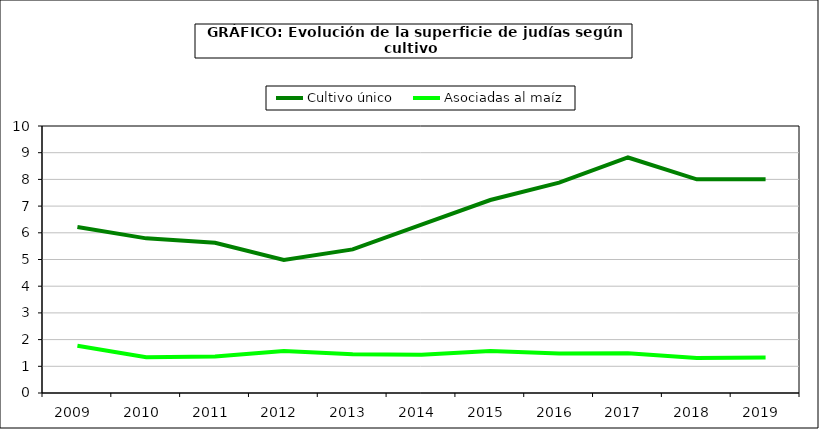
| Category | Cultivo único | Asociadas al maíz |
|---|---|---|
| 2009.0 | 6.216 | 1.766 |
| 2010.0 | 5.792 | 1.338 |
| 2011.0 | 5.626 | 1.363 |
| 2012.0 | 4.982 | 1.572 |
| 2013.0 | 5.378 | 1.451 |
| 2014.0 | 6.305 | 1.432 |
| 2015.0 | 7.227 | 1.575 |
| 2016.0 | 7.876 | 1.479 |
| 2017.0 | 8.821 | 1.489 |
| 2018.0 | 8.003 | 1.312 |
| 2019.0 | 8.001 | 1.325 |